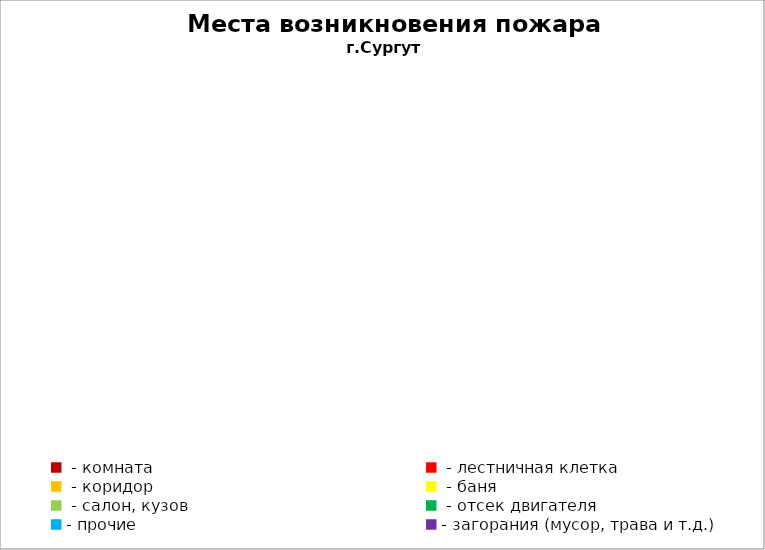
| Category | Места возникновения пожара |
|---|---|
|  - комната | 72 |
|  - лестничная клетка | 35 |
|  - коридор | 4 |
|  - баня | 53 |
|  - салон, кузов | 26 |
|  - отсек двигателя | 31 |
| - прочие | 116 |
| - загорания (мусор, трава и т.д.)  | 180 |